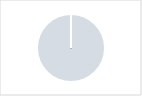
| Category | Series 0 |
|---|---|
| 0 | 0 |
| 1 | 15 |